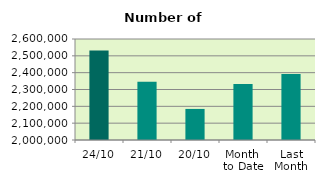
| Category | Series 0 |
|---|---|
| 24/10 | 2532424 |
| 21/10 | 2345308 |
| 20/10 | 2184576 |
| Month 
to Date | 2332199.5 |
| Last
Month | 2392468.182 |